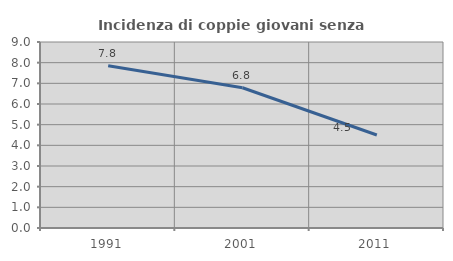
| Category | Incidenza di coppie giovani senza figli |
|---|---|
| 1991.0 | 7.849 |
| 2001.0 | 6.786 |
| 2011.0 | 4.501 |